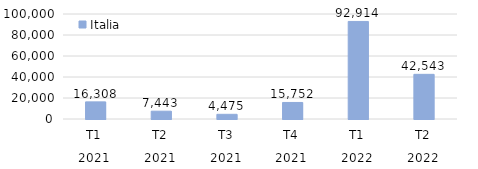
| Category | Italia |
|---|---|
| 0 | 16308.244 |
| 1 | 7443.22 |
| 2 | 4474.609 |
| 3 | 15752.141 |
| 4 | 92913.756 |
| 5 | 42542.711 |